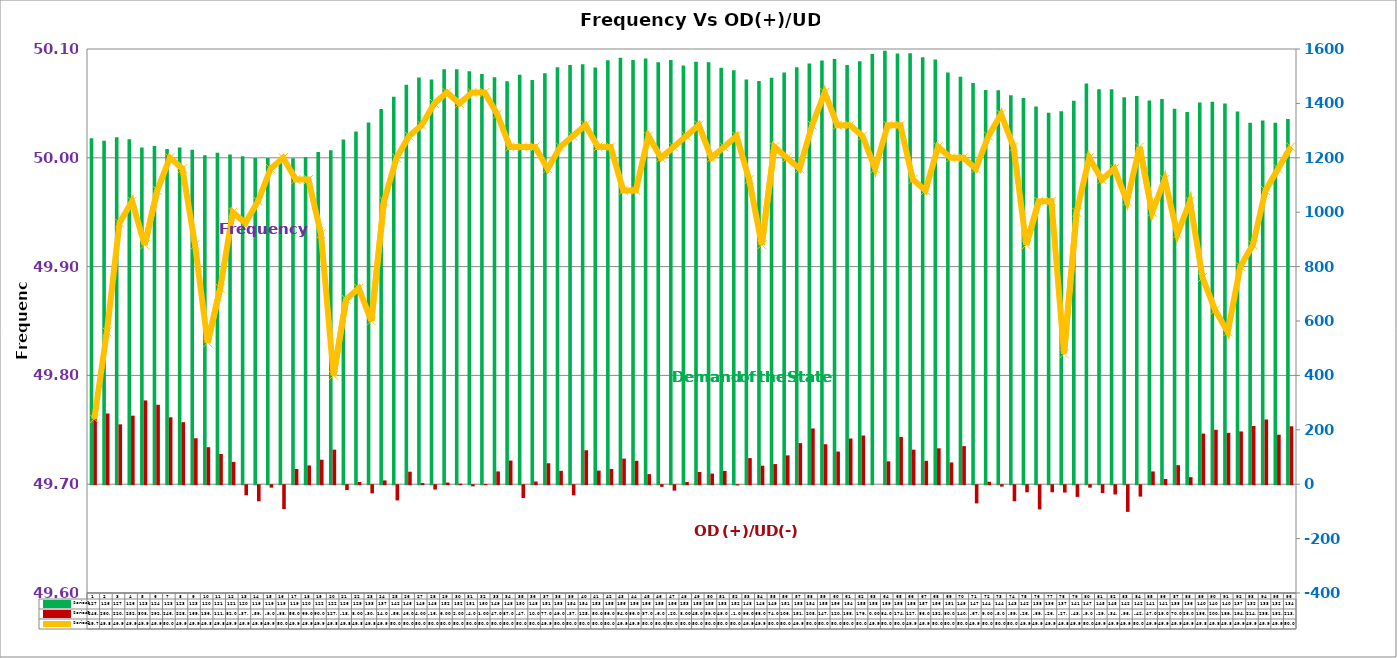
| Category | Series 2 | Series 4 |
|---|---|---|
| 0 | 1272 | 248 |
| 1 | 1263 | 260 |
| 2 | 1276 | 220 |
| 3 | 1268 | 252 |
| 4 | 1238 | 308 |
| 5 | 1243 | 292 |
| 6 | 1232 | 246 |
| 7 | 1238 | 228 |
| 8 | 1230 | 169 |
| 9 | 1209 | 136 |
| 10 | 1219 | 111 |
| 11 | 1212 | 82 |
| 12 | 1206 | -37 |
| 13 | 1199 | -59 |
| 14 | 1199 | -9 |
| 15 | 1192 | -88 |
| 16 | 1198 | 56 |
| 17 | 1203 | 69 |
| 18 | 1221 | 90 |
| 19 | 1228 | 127 |
| 20 | 1267 | -18 |
| 21 | 1297 | 8 |
| 22 | 1330 | -30 |
| 23 | 1379 | 14 |
| 24 | 1424 | -56 |
| 25 | 1469 | 46 |
| 26 | 1495 | 4 |
| 27 | 1488 | -16 |
| 28 | 1526 | 6 |
| 29 | 1526 | 2 |
| 30 | 1518 | -4 |
| 31 | 1508 | 1 |
| 32 | 1496 | 47 |
| 33 | 1481 | 87 |
| 34 | 1505 | -47 |
| 35 | 1486 | 10 |
| 36 | 1511 | 77 |
| 37 | 1533 | 49 |
| 38 | 1541 | -37 |
| 39 | 1544 | 125 |
| 40 | 1532 | 50 |
| 41 | 1559 | 56 |
| 42 | 1568 | 94 |
| 43 | 1560 | 86 |
| 44 | 1565 | 37 |
| 45 | 1551 | -6 |
| 46 | 1560 | -20 |
| 47 | 1539 | 8 |
| 48 | 1553 | 45 |
| 49 | 1551 | 39 |
| 50 | 1531 | 49 |
| 51 | 1522 | -1 |
| 52 | 1488 | 96 |
| 53 | 1482 | 68 |
| 54 | 1494 | 74 |
| 55 | 1514 | 106 |
| 56 | 1533 | 151 |
| 57 | 1547 | 205 |
| 58 | 1558 | 147 |
| 59 | 1563 | 120 |
| 60 | 1541 | 168 |
| 61 | 1555 | 179 |
| 62 | 1582 | 0 |
| 63 | 1594 | 84 |
| 64 | 1583 | 174 |
| 65 | 1584 | 127 |
| 66 | 1570 | 86 |
| 67 | 1561 | 132 |
| 68 | 1514 | 80 |
| 69 | 1498 | 140 |
| 70 | 1475 | -67 |
| 71 | 1449 | 9 |
| 72 | 1448 | -5 |
| 73 | 1430 | -59 |
| 74 | 1420 | -26 |
| 75 | 1389 | -89 |
| 76 | 1366 | -26 |
| 77 | 1371 | -27 |
| 78 | 1410 | -43 |
| 79 | 1473 | -9 |
| 80 | 1452 | -29 |
| 81 | 1452 | -34 |
| 82 | 1423 | -98 |
| 83 | 1427 | -42 |
| 84 | 1411 | 47 |
| 85 | 1416 | 19 |
| 86 | 1380 | 70 |
| 87 | 1368 | 26 |
| 88 | 1403 | 186 |
| 89 | 1406 | 200 |
| 90 | 1400 | 189 |
| 91 | 1370 | 194 |
| 92 | 1329 | 214 |
| 93 | 1337 | 238 |
| 94 | 1329 | 182 |
| 95 | 1343 | 213 |